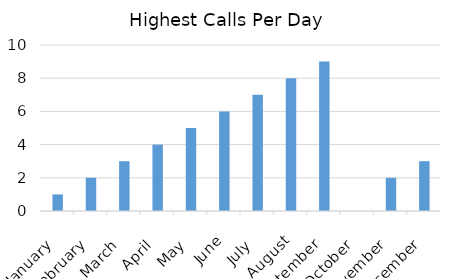
| Category | Highest Calls Per Day |
|---|---|
| 1900-01-01 | 1 |
| 1900-02-28 | 2 |
| 1900-03-31 | 3 |
| 1900-04-30 | 4 |
| 1900-05-31 | 5 |
| 1900-06-30 | 6 |
| 1900-07-31 | 7 |
| 1900-08-31 | 8 |
| 1900-09-30 | 9 |
| 1900-10-31 | 0 |
| 1900-11-30 | 2 |
| 1900-12-31 | 3 |